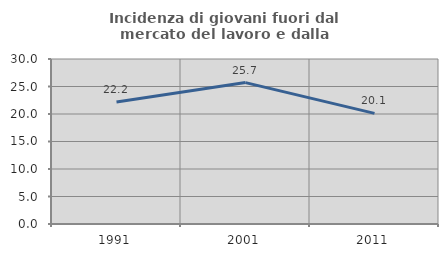
| Category | Incidenza di giovani fuori dal mercato del lavoro e dalla formazione  |
|---|---|
| 1991.0 | 22.198 |
| 2001.0 | 25.71 |
| 2011.0 | 20.114 |